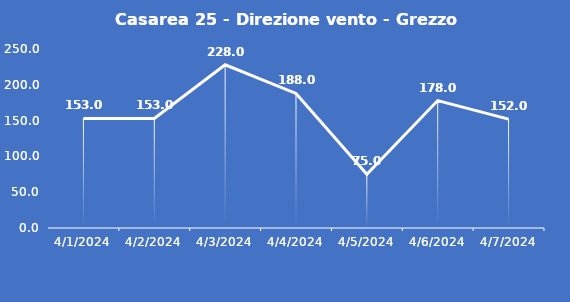
| Category | Casarea 25 - Direzione vento - Grezzo (°N) |
|---|---|
| 4/1/24 | 153 |
| 4/2/24 | 153 |
| 4/3/24 | 228 |
| 4/4/24 | 188 |
| 4/5/24 | 75 |
| 4/6/24 | 178 |
| 4/7/24 | 152 |